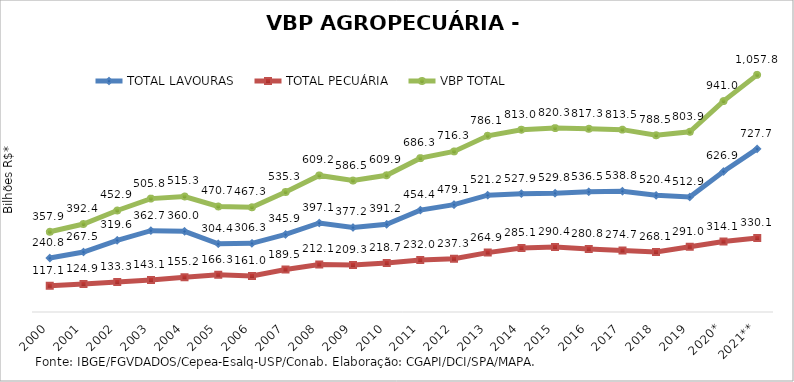
| Category | TOTAL LAVOURAS | TOTAL PECUÁRIA | VBP TOTAL |
|---|---|---|---|
| 2000 | 240.829 | 117.064 | 357.893 |
| 2001 | 267.516 | 124.893 | 392.409 |
| 2002 | 319.557 | 133.324 | 452.881 |
| 2003 | 362.695 | 143.1 | 505.795 |
| 2004 | 360.039 | 155.222 | 515.262 |
| 2005 | 304.397 | 166.281 | 470.678 |
| 2006 | 306.257 | 161.045 | 467.302 |
| 2007 | 345.861 | 189.461 | 535.322 |
| 2008 | 397.134 | 212.052 | 609.186 |
| 2009 | 377.225 | 209.294 | 586.518 |
| 2010 | 391.224 | 218.671 | 609.895 |
| 2011 | 454.358 | 231.954 | 686.312 |
| 2012 | 479.065 | 237.275 | 716.341 |
| 2013 | 521.226 | 264.889 | 786.115 |
| 2014 | 527.932 | 285.096 | 813.028 |
| 2015 | 529.848 | 290.435 | 820.283 |
| 2016 | 536.548 | 280.778 | 817.326 |
| 2017 | 538.775 | 274.745 | 813.52 |
| 2018 | 520.427 | 268.1 | 788.527 |
| 2019 | 512.943 | 290.966 | 803.909 |
| 2020* | 626.926 | 314.054 | 940.98 |
| 2021** | 727.717 | 330.124 | 1057.841 |